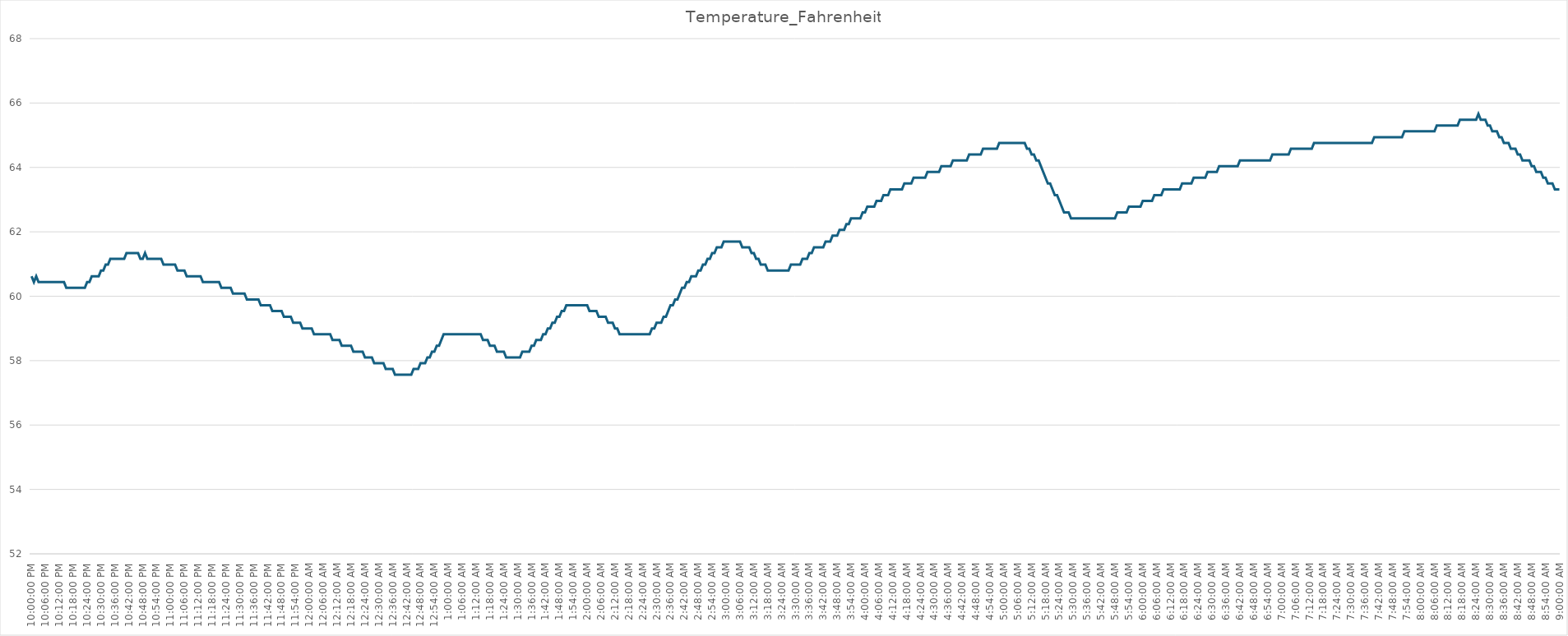
| Category | Temperature_Fahrenheit |
|---|---|
| 2024-03-09 22:00:00 | 60.62 |
| 2024-03-09 22:01:00 | 60.44 |
| 2024-03-09 22:02:00 | 60.62 |
| 2024-03-09 22:03:00 | 60.44 |
| 2024-03-09 22:04:00 | 60.44 |
| 2024-03-09 22:05:00 | 60.44 |
| 2024-03-09 22:06:00 | 60.44 |
| 2024-03-09 22:07:00 | 60.44 |
| 2024-03-09 22:08:00 | 60.44 |
| 2024-03-09 22:09:00 | 60.44 |
| 2024-03-09 22:10:00 | 60.44 |
| 2024-03-09 22:11:00 | 60.44 |
| 2024-03-09 22:12:00 | 60.44 |
| 2024-03-09 22:13:00 | 60.44 |
| 2024-03-09 22:14:00 | 60.44 |
| 2024-03-09 22:15:00 | 60.26 |
| 2024-03-09 22:16:00 | 60.26 |
| 2024-03-09 22:17:00 | 60.26 |
| 2024-03-09 22:18:00 | 60.26 |
| 2024-03-09 22:19:00 | 60.26 |
| 2024-03-09 22:20:00 | 60.26 |
| 2024-03-09 22:21:00 | 60.26 |
| 2024-03-09 22:22:00 | 60.26 |
| 2024-03-09 22:23:00 | 60.26 |
| 2024-03-09 22:24:00 | 60.44 |
| 2024-03-09 22:25:00 | 60.44 |
| 2024-03-09 22:26:00 | 60.62 |
| 2024-03-09 22:27:00 | 60.62 |
| 2024-03-09 22:28:00 | 60.62 |
| 2024-03-09 22:29:00 | 60.62 |
| 2024-03-09 22:30:00 | 60.8 |
| 2024-03-09 22:31:00 | 60.8 |
| 2024-03-09 22:32:00 | 60.98 |
| 2024-03-09 22:33:00 | 60.98 |
| 2024-03-09 22:34:00 | 61.16 |
| 2024-03-09 22:35:00 | 61.16 |
| 2024-03-09 22:36:00 | 61.16 |
| 2024-03-09 22:37:00 | 61.16 |
| 2024-03-09 22:38:00 | 61.16 |
| 2024-03-09 22:39:00 | 61.16 |
| 2024-03-09 22:40:00 | 61.16 |
| 2024-03-09 22:41:00 | 61.34 |
| 2024-03-09 22:42:00 | 61.34 |
| 2024-03-09 22:43:00 | 61.34 |
| 2024-03-09 22:44:00 | 61.34 |
| 2024-03-09 22:45:00 | 61.34 |
| 2024-03-09 22:46:00 | 61.34 |
| 2024-03-09 22:47:00 | 61.16 |
| 2024-03-09 22:48:00 | 61.16 |
| 2024-03-09 22:49:00 | 61.34 |
| 2024-03-09 22:50:00 | 61.16 |
| 2024-03-09 22:51:00 | 61.16 |
| 2024-03-09 22:52:00 | 61.16 |
| 2024-03-09 22:53:00 | 61.16 |
| 2024-03-09 22:54:00 | 61.16 |
| 2024-03-09 22:55:00 | 61.16 |
| 2024-03-09 22:56:00 | 61.16 |
| 2024-03-09 22:57:00 | 60.98 |
| 2024-03-09 22:58:00 | 60.98 |
| 2024-03-09 22:59:00 | 60.98 |
| 2024-03-09 23:00:00 | 60.98 |
| 2024-03-09 23:01:00 | 60.98 |
| 2024-03-09 23:02:00 | 60.98 |
| 2024-03-09 23:03:00 | 60.8 |
| 2024-03-09 23:04:00 | 60.8 |
| 2024-03-09 23:05:00 | 60.8 |
| 2024-03-09 23:06:00 | 60.8 |
| 2024-03-09 23:07:00 | 60.62 |
| 2024-03-09 23:08:00 | 60.62 |
| 2024-03-09 23:09:00 | 60.62 |
| 2024-03-09 23:10:00 | 60.62 |
| 2024-03-09 23:11:00 | 60.62 |
| 2024-03-09 23:12:00 | 60.62 |
| 2024-03-09 23:13:00 | 60.62 |
| 2024-03-09 23:14:00 | 60.44 |
| 2024-03-09 23:15:00 | 60.44 |
| 2024-03-09 23:16:00 | 60.44 |
| 2024-03-09 23:17:00 | 60.44 |
| 2024-03-09 23:18:00 | 60.44 |
| 2024-03-09 23:19:00 | 60.44 |
| 2024-03-09 23:20:00 | 60.44 |
| 2024-03-09 23:21:00 | 60.44 |
| 2024-03-09 23:22:00 | 60.26 |
| 2024-03-09 23:23:00 | 60.26 |
| 2024-03-09 23:24:00 | 60.26 |
| 2024-03-09 23:25:00 | 60.26 |
| 2024-03-09 23:26:00 | 60.26 |
| 2024-03-09 23:27:00 | 60.08 |
| 2024-03-09 23:28:00 | 60.08 |
| 2024-03-09 23:29:00 | 60.08 |
| 2024-03-09 23:30:00 | 60.08 |
| 2024-03-09 23:31:00 | 60.08 |
| 2024-03-09 23:32:00 | 60.08 |
| 2024-03-09 23:33:00 | 59.9 |
| 2024-03-09 23:34:00 | 59.9 |
| 2024-03-09 23:35:00 | 59.9 |
| 2024-03-09 23:36:00 | 59.9 |
| 2024-03-09 23:37:00 | 59.9 |
| 2024-03-09 23:38:00 | 59.9 |
| 2024-03-09 23:39:00 | 59.72 |
| 2024-03-09 23:40:00 | 59.72 |
| 2024-03-09 23:41:00 | 59.72 |
| 2024-03-09 23:42:00 | 59.72 |
| 2024-03-09 23:43:00 | 59.72 |
| 2024-03-09 23:44:00 | 59.54 |
| 2024-03-09 23:45:00 | 59.54 |
| 2024-03-09 23:46:00 | 59.54 |
| 2024-03-09 23:47:00 | 59.54 |
| 2024-03-09 23:48:00 | 59.54 |
| 2024-03-09 23:49:00 | 59.36 |
| 2024-03-09 23:50:00 | 59.36 |
| 2024-03-09 23:51:00 | 59.36 |
| 2024-03-09 23:52:00 | 59.36 |
| 2024-03-09 23:53:00 | 59.18 |
| 2024-03-09 23:54:00 | 59.18 |
| 2024-03-09 23:55:00 | 59.18 |
| 2024-03-09 23:56:00 | 59.18 |
| 2024-03-09 23:57:00 | 59 |
| 2024-03-09 23:58:00 | 59 |
| 2024-03-09 23:59:00 | 59 |
| 2024-03-10 | 59 |
| 2024-03-10 00:01:00 | 59 |
| 2024-03-10 00:02:00 | 58.82 |
| 2024-03-10 00:03:00 | 58.82 |
| 2024-03-10 00:04:00 | 58.82 |
| 2024-03-10 00:05:00 | 58.82 |
| 2024-03-10 00:06:00 | 58.82 |
| 2024-03-10 00:07:00 | 58.82 |
| 2024-03-10 00:08:00 | 58.82 |
| 2024-03-10 00:09:00 | 58.82 |
| 2024-03-10 00:10:00 | 58.64 |
| 2024-03-10 00:11:00 | 58.64 |
| 2024-03-10 00:12:00 | 58.64 |
| 2024-03-10 00:13:00 | 58.64 |
| 2024-03-10 00:14:00 | 58.46 |
| 2024-03-10 00:15:00 | 58.46 |
| 2024-03-10 00:16:00 | 58.46 |
| 2024-03-10 00:17:00 | 58.46 |
| 2024-03-10 00:18:00 | 58.46 |
| 2024-03-10 00:19:00 | 58.28 |
| 2024-03-10 00:20:00 | 58.28 |
| 2024-03-10 00:21:00 | 58.28 |
| 2024-03-10 00:22:00 | 58.28 |
| 2024-03-10 00:23:00 | 58.28 |
| 2024-03-10 00:24:00 | 58.1 |
| 2024-03-10 00:25:00 | 58.1 |
| 2024-03-10 00:26:00 | 58.1 |
| 2024-03-10 00:27:00 | 58.1 |
| 2024-03-10 00:28:00 | 57.92 |
| 2024-03-10 00:29:00 | 57.92 |
| 2024-03-10 00:30:00 | 57.92 |
| 2024-03-10 00:31:00 | 57.92 |
| 2024-03-10 00:32:00 | 57.92 |
| 2024-03-10 00:33:00 | 57.74 |
| 2024-03-10 00:34:00 | 57.74 |
| 2024-03-10 00:35:00 | 57.74 |
| 2024-03-10 00:36:00 | 57.74 |
| 2024-03-10 00:37:00 | 57.56 |
| 2024-03-10 00:38:00 | 57.56 |
| 2024-03-10 00:39:00 | 57.56 |
| 2024-03-10 00:40:00 | 57.56 |
| 2024-03-10 00:41:00 | 57.56 |
| 2024-03-10 00:42:00 | 57.56 |
| 2024-03-10 00:43:00 | 57.56 |
| 2024-03-10 00:44:00 | 57.56 |
| 2024-03-10 00:45:00 | 57.74 |
| 2024-03-10 00:46:00 | 57.74 |
| 2024-03-10 00:47:00 | 57.74 |
| 2024-03-10 00:48:00 | 57.92 |
| 2024-03-10 00:49:00 | 57.92 |
| 2024-03-10 00:50:00 | 57.92 |
| 2024-03-10 00:51:00 | 58.1 |
| 2024-03-10 00:52:00 | 58.1 |
| 2024-03-10 00:53:00 | 58.28 |
| 2024-03-10 00:54:00 | 58.28 |
| 2024-03-10 00:55:00 | 58.46 |
| 2024-03-10 00:56:00 | 58.46 |
| 2024-03-10 00:57:00 | 58.64 |
| 2024-03-10 00:58:00 | 58.82 |
| 2024-03-10 00:59:00 | 58.82 |
| 2024-03-10 01:00:00 | 58.82 |
| 2024-03-10 01:01:00 | 58.82 |
| 2024-03-10 01:02:00 | 58.82 |
| 2024-03-10 01:03:00 | 58.82 |
| 2024-03-10 01:04:00 | 58.82 |
| 2024-03-10 01:05:00 | 58.82 |
| 2024-03-10 01:06:00 | 58.82 |
| 2024-03-10 01:07:00 | 58.82 |
| 2024-03-10 01:08:00 | 58.82 |
| 2024-03-10 01:09:00 | 58.82 |
| 2024-03-10 01:10:00 | 58.82 |
| 2024-03-10 01:11:00 | 58.82 |
| 2024-03-10 01:12:00 | 58.82 |
| 2024-03-10 01:13:00 | 58.82 |
| 2024-03-10 01:14:00 | 58.82 |
| 2024-03-10 01:15:00 | 58.64 |
| 2024-03-10 01:16:00 | 58.64 |
| 2024-03-10 01:17:00 | 58.64 |
| 2024-03-10 01:18:00 | 58.46 |
| 2024-03-10 01:19:00 | 58.46 |
| 2024-03-10 01:20:00 | 58.46 |
| 2024-03-10 01:21:00 | 58.28 |
| 2024-03-10 01:22:00 | 58.28 |
| 2024-03-10 01:23:00 | 58.28 |
| 2024-03-10 01:24:00 | 58.28 |
| 2024-03-10 01:25:00 | 58.1 |
| 2024-03-10 01:26:00 | 58.1 |
| 2024-03-10 01:27:00 | 58.1 |
| 2024-03-10 01:28:00 | 58.1 |
| 2024-03-10 01:29:00 | 58.1 |
| 2024-03-10 01:30:00 | 58.1 |
| 2024-03-10 01:31:00 | 58.1 |
| 2024-03-10 01:32:00 | 58.28 |
| 2024-03-10 01:33:00 | 58.28 |
| 2024-03-10 01:34:00 | 58.28 |
| 2024-03-10 01:35:00 | 58.28 |
| 2024-03-10 01:36:00 | 58.46 |
| 2024-03-10 01:37:00 | 58.46 |
| 2024-03-10 01:38:00 | 58.64 |
| 2024-03-10 01:39:00 | 58.64 |
| 2024-03-10 01:40:00 | 58.64 |
| 2024-03-10 01:41:00 | 58.82 |
| 2024-03-10 01:42:00 | 58.82 |
| 2024-03-10 01:43:00 | 59 |
| 2024-03-10 01:44:00 | 59 |
| 2024-03-10 01:45:00 | 59.18 |
| 2024-03-10 01:46:00 | 59.18 |
| 2024-03-10 01:47:00 | 59.36 |
| 2024-03-10 01:48:00 | 59.36 |
| 2024-03-10 01:49:00 | 59.54 |
| 2024-03-10 01:50:00 | 59.54 |
| 2024-03-10 01:51:00 | 59.72 |
| 2024-03-10 01:52:00 | 59.72 |
| 2024-03-10 01:53:00 | 59.72 |
| 2024-03-10 01:54:00 | 59.72 |
| 2024-03-10 01:55:00 | 59.72 |
| 2024-03-10 01:56:00 | 59.72 |
| 2024-03-10 01:57:00 | 59.72 |
| 2024-03-10 01:58:00 | 59.72 |
| 2024-03-10 01:59:00 | 59.72 |
| 2024-03-10 02:00:00 | 59.72 |
| 2024-03-10 02:01:00 | 59.54 |
| 2024-03-10 02:02:00 | 59.54 |
| 2024-03-10 02:03:00 | 59.54 |
| 2024-03-10 02:04:00 | 59.54 |
| 2024-03-10 02:05:00 | 59.36 |
| 2024-03-10 02:06:00 | 59.36 |
| 2024-03-10 02:07:00 | 59.36 |
| 2024-03-10 02:08:00 | 59.36 |
| 2024-03-10 02:09:00 | 59.18 |
| 2024-03-10 02:10:00 | 59.18 |
| 2024-03-10 02:11:00 | 59.18 |
| 2024-03-10 02:12:00 | 59 |
| 2024-03-10 02:13:00 | 59 |
| 2024-03-10 02:14:00 | 58.82 |
| 2024-03-10 02:15:00 | 58.82 |
| 2024-03-10 02:16:00 | 58.82 |
| 2024-03-10 02:17:00 | 58.82 |
| 2024-03-10 02:18:00 | 58.82 |
| 2024-03-10 02:19:00 | 58.82 |
| 2024-03-10 02:20:00 | 58.82 |
| 2024-03-10 02:21:00 | 58.82 |
| 2024-03-10 02:22:00 | 58.82 |
| 2024-03-10 02:23:00 | 58.82 |
| 2024-03-10 02:24:00 | 58.82 |
| 2024-03-10 02:25:00 | 58.82 |
| 2024-03-10 02:26:00 | 58.82 |
| 2024-03-10 02:27:00 | 58.82 |
| 2024-03-10 02:28:00 | 59 |
| 2024-03-10 02:29:00 | 59 |
| 2024-03-10 02:30:00 | 59.18 |
| 2024-03-10 02:31:00 | 59.18 |
| 2024-03-10 02:32:00 | 59.18 |
| 2024-03-10 02:33:00 | 59.36 |
| 2024-03-10 02:34:00 | 59.36 |
| 2024-03-10 02:35:00 | 59.54 |
| 2024-03-10 02:36:00 | 59.72 |
| 2024-03-10 02:37:00 | 59.72 |
| 2024-03-10 02:38:00 | 59.9 |
| 2024-03-10 02:39:00 | 59.9 |
| 2024-03-10 02:40:00 | 60.08 |
| 2024-03-10 02:41:00 | 60.26 |
| 2024-03-10 02:42:00 | 60.26 |
| 2024-03-10 02:43:00 | 60.44 |
| 2024-03-10 02:44:00 | 60.44 |
| 2024-03-10 02:45:00 | 60.62 |
| 2024-03-10 02:46:00 | 60.62 |
| 2024-03-10 02:47:00 | 60.62 |
| 2024-03-10 02:48:00 | 60.8 |
| 2024-03-10 02:49:00 | 60.8 |
| 2024-03-10 02:50:00 | 60.98 |
| 2024-03-10 02:51:00 | 60.98 |
| 2024-03-10 02:52:00 | 61.16 |
| 2024-03-10 02:53:00 | 61.16 |
| 2024-03-10 02:54:00 | 61.34 |
| 2024-03-10 02:55:00 | 61.34 |
| 2024-03-10 02:56:00 | 61.52 |
| 2024-03-10 02:57:00 | 61.52 |
| 2024-03-10 02:58:00 | 61.52 |
| 2024-03-10 02:59:00 | 61.7 |
| 2024-03-10 03:00:00 | 61.7 |
| 2024-03-10 03:01:00 | 61.7 |
| 2024-03-10 03:02:00 | 61.7 |
| 2024-03-10 03:03:00 | 61.7 |
| 2024-03-10 03:04:00 | 61.7 |
| 2024-03-10 03:05:00 | 61.7 |
| 2024-03-10 03:06:00 | 61.7 |
| 2024-03-10 03:07:00 | 61.52 |
| 2024-03-10 03:08:00 | 61.52 |
| 2024-03-10 03:09:00 | 61.52 |
| 2024-03-10 03:10:00 | 61.52 |
| 2024-03-10 03:11:00 | 61.34 |
| 2024-03-10 03:12:00 | 61.34 |
| 2024-03-10 03:13:00 | 61.16 |
| 2024-03-10 03:14:00 | 61.16 |
| 2024-03-10 03:15:00 | 60.98 |
| 2024-03-10 03:16:00 | 60.98 |
| 2024-03-10 03:17:00 | 60.98 |
| 2024-03-10 03:18:00 | 60.8 |
| 2024-03-10 03:19:00 | 60.8 |
| 2024-03-10 03:20:00 | 60.8 |
| 2024-03-10 03:21:00 | 60.8 |
| 2024-03-10 03:22:00 | 60.8 |
| 2024-03-10 03:23:00 | 60.8 |
| 2024-03-10 03:24:00 | 60.8 |
| 2024-03-10 03:25:00 | 60.8 |
| 2024-03-10 03:26:00 | 60.8 |
| 2024-03-10 03:27:00 | 60.8 |
| 2024-03-10 03:28:00 | 60.98 |
| 2024-03-10 03:29:00 | 60.98 |
| 2024-03-10 03:30:00 | 60.98 |
| 2024-03-10 03:31:00 | 60.98 |
| 2024-03-10 03:32:00 | 60.98 |
| 2024-03-10 03:33:00 | 61.16 |
| 2024-03-10 03:34:00 | 61.16 |
| 2024-03-10 03:35:00 | 61.16 |
| 2024-03-10 03:36:00 | 61.34 |
| 2024-03-10 03:37:00 | 61.34 |
| 2024-03-10 03:38:00 | 61.52 |
| 2024-03-10 03:39:00 | 61.52 |
| 2024-03-10 03:40:00 | 61.52 |
| 2024-03-10 03:41:00 | 61.52 |
| 2024-03-10 03:42:00 | 61.52 |
| 2024-03-10 03:43:00 | 61.7 |
| 2024-03-10 03:44:00 | 61.7 |
| 2024-03-10 03:45:00 | 61.7 |
| 2024-03-10 03:46:00 | 61.88 |
| 2024-03-10 03:47:00 | 61.88 |
| 2024-03-10 03:48:00 | 61.88 |
| 2024-03-10 03:49:00 | 62.06 |
| 2024-03-10 03:50:00 | 62.06 |
| 2024-03-10 03:51:00 | 62.06 |
| 2024-03-10 03:52:00 | 62.24 |
| 2024-03-10 03:53:00 | 62.24 |
| 2024-03-10 03:54:00 | 62.42 |
| 2024-03-10 03:55:00 | 62.42 |
| 2024-03-10 03:56:00 | 62.42 |
| 2024-03-10 03:57:00 | 62.42 |
| 2024-03-10 03:58:00 | 62.42 |
| 2024-03-10 03:59:00 | 62.6 |
| 2024-03-10 04:00:00 | 62.6 |
| 2024-03-10 04:01:00 | 62.78 |
| 2024-03-10 04:02:00 | 62.78 |
| 2024-03-10 04:03:00 | 62.78 |
| 2024-03-10 04:04:00 | 62.78 |
| 2024-03-10 04:05:00 | 62.96 |
| 2024-03-10 04:06:00 | 62.96 |
| 2024-03-10 04:07:00 | 62.96 |
| 2024-03-10 04:08:00 | 63.14 |
| 2024-03-10 04:09:00 | 63.14 |
| 2024-03-10 04:10:00 | 63.14 |
| 2024-03-10 04:11:00 | 63.32 |
| 2024-03-10 04:12:00 | 63.32 |
| 2024-03-10 04:13:00 | 63.32 |
| 2024-03-10 04:14:00 | 63.32 |
| 2024-03-10 04:15:00 | 63.32 |
| 2024-03-10 04:16:00 | 63.32 |
| 2024-03-10 04:17:00 | 63.5 |
| 2024-03-10 04:18:00 | 63.5 |
| 2024-03-10 04:19:00 | 63.5 |
| 2024-03-10 04:20:00 | 63.5 |
| 2024-03-10 04:21:00 | 63.68 |
| 2024-03-10 04:22:00 | 63.68 |
| 2024-03-10 04:23:00 | 63.68 |
| 2024-03-10 04:24:00 | 63.68 |
| 2024-03-10 04:25:00 | 63.68 |
| 2024-03-10 04:26:00 | 63.68 |
| 2024-03-10 04:27:00 | 63.86 |
| 2024-03-10 04:28:00 | 63.86 |
| 2024-03-10 04:29:00 | 63.86 |
| 2024-03-10 04:30:00 | 63.86 |
| 2024-03-10 04:31:00 | 63.86 |
| 2024-03-10 04:32:00 | 63.86 |
| 2024-03-10 04:33:00 | 64.04 |
| 2024-03-10 04:34:00 | 64.04 |
| 2024-03-10 04:35:00 | 64.04 |
| 2024-03-10 04:36:00 | 64.04 |
| 2024-03-10 04:37:00 | 64.04 |
| 2024-03-10 04:38:00 | 64.22 |
| 2024-03-10 04:39:00 | 64.22 |
| 2024-03-10 04:40:00 | 64.22 |
| 2024-03-10 04:41:00 | 64.22 |
| 2024-03-10 04:42:00 | 64.22 |
| 2024-03-10 04:43:00 | 64.22 |
| 2024-03-10 04:44:00 | 64.22 |
| 2024-03-10 04:45:00 | 64.4 |
| 2024-03-10 04:46:00 | 64.4 |
| 2024-03-10 04:47:00 | 64.4 |
| 2024-03-10 04:48:00 | 64.4 |
| 2024-03-10 04:49:00 | 64.4 |
| 2024-03-10 04:50:00 | 64.4 |
| 2024-03-10 04:51:00 | 64.58 |
| 2024-03-10 04:52:00 | 64.58 |
| 2024-03-10 04:53:00 | 64.58 |
| 2024-03-10 04:54:00 | 64.58 |
| 2024-03-10 04:55:00 | 64.58 |
| 2024-03-10 04:56:00 | 64.58 |
| 2024-03-10 04:57:00 | 64.58 |
| 2024-03-10 04:58:00 | 64.76 |
| 2024-03-10 04:59:00 | 64.76 |
| 2024-03-10 05:00:00 | 64.76 |
| 2024-03-10 05:01:00 | 64.76 |
| 2024-03-10 05:02:00 | 64.76 |
| 2024-03-10 05:03:00 | 64.76 |
| 2024-03-10 05:04:00 | 64.76 |
| 2024-03-10 05:05:00 | 64.76 |
| 2024-03-10 05:06:00 | 64.76 |
| 2024-03-10 05:07:00 | 64.76 |
| 2024-03-10 05:08:00 | 64.76 |
| 2024-03-10 05:09:00 | 64.76 |
| 2024-03-10 05:10:00 | 64.58 |
| 2024-03-10 05:11:00 | 64.58 |
| 2024-03-10 05:12:00 | 64.4 |
| 2024-03-10 05:13:00 | 64.4 |
| 2024-03-10 05:14:00 | 64.22 |
| 2024-03-10 05:15:00 | 64.22 |
| 2024-03-10 05:16:00 | 64.04 |
| 2024-03-10 05:17:00 | 63.86 |
| 2024-03-10 05:18:00 | 63.68 |
| 2024-03-10 05:19:00 | 63.5 |
| 2024-03-10 05:20:00 | 63.5 |
| 2024-03-10 05:21:00 | 63.32 |
| 2024-03-10 05:22:00 | 63.14 |
| 2024-03-10 05:23:00 | 63.14 |
| 2024-03-10 05:24:00 | 62.96 |
| 2024-03-10 05:25:00 | 62.78 |
| 2024-03-10 05:26:00 | 62.6 |
| 2024-03-10 05:27:00 | 62.6 |
| 2024-03-10 05:28:00 | 62.6 |
| 2024-03-10 05:29:00 | 62.42 |
| 2024-03-10 05:30:00 | 62.42 |
| 2024-03-10 05:31:00 | 62.42 |
| 2024-03-10 05:32:00 | 62.42 |
| 2024-03-10 05:33:00 | 62.42 |
| 2024-03-10 05:34:00 | 62.42 |
| 2024-03-10 05:35:00 | 62.42 |
| 2024-03-10 05:36:00 | 62.42 |
| 2024-03-10 05:37:00 | 62.42 |
| 2024-03-10 05:38:00 | 62.42 |
| 2024-03-10 05:39:00 | 62.42 |
| 2024-03-10 05:40:00 | 62.42 |
| 2024-03-10 05:41:00 | 62.42 |
| 2024-03-10 05:42:00 | 62.42 |
| 2024-03-10 05:43:00 | 62.42 |
| 2024-03-10 05:44:00 | 62.42 |
| 2024-03-10 05:45:00 | 62.42 |
| 2024-03-10 05:46:00 | 62.42 |
| 2024-03-10 05:47:00 | 62.42 |
| 2024-03-10 05:48:00 | 62.42 |
| 2024-03-10 05:49:00 | 62.6 |
| 2024-03-10 05:50:00 | 62.6 |
| 2024-03-10 05:51:00 | 62.6 |
| 2024-03-10 05:52:00 | 62.6 |
| 2024-03-10 05:53:00 | 62.6 |
| 2024-03-10 05:54:00 | 62.78 |
| 2024-03-10 05:55:00 | 62.78 |
| 2024-03-10 05:56:00 | 62.78 |
| 2024-03-10 05:57:00 | 62.78 |
| 2024-03-10 05:58:00 | 62.78 |
| 2024-03-10 05:59:00 | 62.78 |
| 2024-03-10 06:00:00 | 62.96 |
| 2024-03-10 06:01:00 | 62.96 |
| 2024-03-10 06:02:00 | 62.96 |
| 2024-03-10 06:03:00 | 62.96 |
| 2024-03-10 06:04:00 | 62.96 |
| 2024-03-10 06:05:00 | 63.14 |
| 2024-03-10 06:06:00 | 63.14 |
| 2024-03-10 06:07:00 | 63.14 |
| 2024-03-10 06:08:00 | 63.14 |
| 2024-03-10 06:09:00 | 63.32 |
| 2024-03-10 06:10:00 | 63.32 |
| 2024-03-10 06:11:00 | 63.32 |
| 2024-03-10 06:12:00 | 63.32 |
| 2024-03-10 06:13:00 | 63.32 |
| 2024-03-10 06:14:00 | 63.32 |
| 2024-03-10 06:15:00 | 63.32 |
| 2024-03-10 06:16:00 | 63.32 |
| 2024-03-10 06:17:00 | 63.5 |
| 2024-03-10 06:18:00 | 63.5 |
| 2024-03-10 06:19:00 | 63.5 |
| 2024-03-10 06:20:00 | 63.5 |
| 2024-03-10 06:21:00 | 63.5 |
| 2024-03-10 06:22:00 | 63.68 |
| 2024-03-10 06:23:00 | 63.68 |
| 2024-03-10 06:24:00 | 63.68 |
| 2024-03-10 06:25:00 | 63.68 |
| 2024-03-10 06:26:00 | 63.68 |
| 2024-03-10 06:27:00 | 63.68 |
| 2024-03-10 06:28:00 | 63.86 |
| 2024-03-10 06:29:00 | 63.86 |
| 2024-03-10 06:30:00 | 63.86 |
| 2024-03-10 06:31:00 | 63.86 |
| 2024-03-10 06:32:00 | 63.86 |
| 2024-03-10 06:33:00 | 64.04 |
| 2024-03-10 06:34:00 | 64.04 |
| 2024-03-10 06:35:00 | 64.04 |
| 2024-03-10 06:36:00 | 64.04 |
| 2024-03-10 06:37:00 | 64.04 |
| 2024-03-10 06:38:00 | 64.04 |
| 2024-03-10 06:39:00 | 64.04 |
| 2024-03-10 06:40:00 | 64.04 |
| 2024-03-10 06:41:00 | 64.04 |
| 2024-03-10 06:42:00 | 64.22 |
| 2024-03-10 06:43:00 | 64.22 |
| 2024-03-10 06:44:00 | 64.22 |
| 2024-03-10 06:45:00 | 64.22 |
| 2024-03-10 06:46:00 | 64.22 |
| 2024-03-10 06:47:00 | 64.22 |
| 2024-03-10 06:48:00 | 64.22 |
| 2024-03-10 06:49:00 | 64.22 |
| 2024-03-10 06:50:00 | 64.22 |
| 2024-03-10 06:51:00 | 64.22 |
| 2024-03-10 06:52:00 | 64.22 |
| 2024-03-10 06:53:00 | 64.22 |
| 2024-03-10 06:54:00 | 64.22 |
| 2024-03-10 06:55:00 | 64.22 |
| 2024-03-10 06:56:00 | 64.4 |
| 2024-03-10 06:57:00 | 64.4 |
| 2024-03-10 06:58:00 | 64.4 |
| 2024-03-10 06:59:00 | 64.4 |
| 2024-03-10 07:00:00 | 64.4 |
| 2024-03-10 07:01:00 | 64.4 |
| 2024-03-10 07:02:00 | 64.4 |
| 2024-03-10 07:03:00 | 64.4 |
| 2024-03-10 07:04:00 | 64.58 |
| 2024-03-10 07:05:00 | 64.58 |
| 2024-03-10 07:06:00 | 64.58 |
| 2024-03-10 07:07:00 | 64.58 |
| 2024-03-10 07:08:00 | 64.58 |
| 2024-03-10 07:09:00 | 64.58 |
| 2024-03-10 07:10:00 | 64.58 |
| 2024-03-10 07:11:00 | 64.58 |
| 2024-03-10 07:12:00 | 64.58 |
| 2024-03-10 07:13:00 | 64.58 |
| 2024-03-10 07:14:00 | 64.76 |
| 2024-03-10 07:15:00 | 64.76 |
| 2024-03-10 07:16:00 | 64.76 |
| 2024-03-10 07:17:00 | 64.76 |
| 2024-03-10 07:18:00 | 64.76 |
| 2024-03-10 07:19:00 | 64.76 |
| 2024-03-10 07:20:00 | 64.76 |
| 2024-03-10 07:21:00 | 64.76 |
| 2024-03-10 07:22:00 | 64.76 |
| 2024-03-10 07:23:00 | 64.76 |
| 2024-03-10 07:24:00 | 64.76 |
| 2024-03-10 07:25:00 | 64.76 |
| 2024-03-10 07:26:00 | 64.76 |
| 2024-03-10 07:27:00 | 64.76 |
| 2024-03-10 07:28:00 | 64.76 |
| 2024-03-10 07:29:00 | 64.76 |
| 2024-03-10 07:30:00 | 64.76 |
| 2024-03-10 07:31:00 | 64.76 |
| 2024-03-10 07:32:00 | 64.76 |
| 2024-03-10 07:33:00 | 64.76 |
| 2024-03-10 07:34:00 | 64.76 |
| 2024-03-10 07:35:00 | 64.76 |
| 2024-03-10 07:36:00 | 64.76 |
| 2024-03-10 07:37:00 | 64.76 |
| 2024-03-10 07:38:00 | 64.76 |
| 2024-03-10 07:39:00 | 64.76 |
| 2024-03-10 07:40:00 | 64.94 |
| 2024-03-10 07:41:00 | 64.94 |
| 2024-03-10 07:42:00 | 64.94 |
| 2024-03-10 07:43:00 | 64.94 |
| 2024-03-10 07:44:00 | 64.94 |
| 2024-03-10 07:45:00 | 64.94 |
| 2024-03-10 07:46:00 | 64.94 |
| 2024-03-10 07:47:00 | 64.94 |
| 2024-03-10 07:48:00 | 64.94 |
| 2024-03-10 07:49:00 | 64.94 |
| 2024-03-10 07:50:00 | 64.94 |
| 2024-03-10 07:51:00 | 64.94 |
| 2024-03-10 07:52:00 | 64.94 |
| 2024-03-10 07:53:00 | 65.12 |
| 2024-03-10 07:54:00 | 65.12 |
| 2024-03-10 07:55:00 | 65.12 |
| 2024-03-10 07:56:00 | 65.12 |
| 2024-03-10 07:57:00 | 65.12 |
| 2024-03-10 07:58:00 | 65.12 |
| 2024-03-10 07:59:00 | 65.12 |
| 2024-03-10 08:00:00 | 65.12 |
| 2024-03-10 08:01:00 | 65.12 |
| 2024-03-10 08:02:00 | 65.12 |
| 2024-03-10 08:03:00 | 65.12 |
| 2024-03-10 08:04:00 | 65.12 |
| 2024-03-10 08:05:00 | 65.12 |
| 2024-03-10 08:06:00 | 65.12 |
| 2024-03-10 08:07:00 | 65.3 |
| 2024-03-10 08:08:00 | 65.3 |
| 2024-03-10 08:09:00 | 65.3 |
| 2024-03-10 08:10:00 | 65.3 |
| 2024-03-10 08:11:00 | 65.3 |
| 2024-03-10 08:12:00 | 65.3 |
| 2024-03-10 08:13:00 | 65.3 |
| 2024-03-10 08:14:00 | 65.3 |
| 2024-03-10 08:15:00 | 65.3 |
| 2024-03-10 08:16:00 | 65.3 |
| 2024-03-10 08:17:00 | 65.48 |
| 2024-03-10 08:18:00 | 65.48 |
| 2024-03-10 08:19:00 | 65.48 |
| 2024-03-10 08:20:00 | 65.48 |
| 2024-03-10 08:21:00 | 65.48 |
| 2024-03-10 08:22:00 | 65.48 |
| 2024-03-10 08:23:00 | 65.48 |
| 2024-03-10 08:24:00 | 65.48 |
| 2024-03-10 08:25:00 | 65.66 |
| 2024-03-10 08:26:00 | 65.48 |
| 2024-03-10 08:27:00 | 65.48 |
| 2024-03-10 08:28:00 | 65.48 |
| 2024-03-10 08:29:00 | 65.3 |
| 2024-03-10 08:30:00 | 65.3 |
| 2024-03-10 08:31:00 | 65.12 |
| 2024-03-10 08:32:00 | 65.12 |
| 2024-03-10 08:33:00 | 65.12 |
| 2024-03-10 08:34:00 | 64.94 |
| 2024-03-10 08:35:00 | 64.94 |
| 2024-03-10 08:36:00 | 64.76 |
| 2024-03-10 08:37:00 | 64.76 |
| 2024-03-10 08:38:00 | 64.76 |
| 2024-03-10 08:39:00 | 64.58 |
| 2024-03-10 08:40:00 | 64.58 |
| 2024-03-10 08:41:00 | 64.58 |
| 2024-03-10 08:42:00 | 64.4 |
| 2024-03-10 08:43:00 | 64.4 |
| 2024-03-10 08:44:00 | 64.22 |
| 2024-03-10 08:45:00 | 64.22 |
| 2024-03-10 08:46:00 | 64.22 |
| 2024-03-10 08:47:00 | 64.22 |
| 2024-03-10 08:48:00 | 64.04 |
| 2024-03-10 08:49:00 | 64.04 |
| 2024-03-10 08:50:00 | 63.86 |
| 2024-03-10 08:51:00 | 63.86 |
| 2024-03-10 08:52:00 | 63.86 |
| 2024-03-10 08:53:00 | 63.68 |
| 2024-03-10 08:54:00 | 63.68 |
| 2024-03-10 08:55:00 | 63.5 |
| 2024-03-10 08:56:00 | 63.5 |
| 2024-03-10 08:57:00 | 63.5 |
| 2024-03-10 08:58:00 | 63.32 |
| 2024-03-10 08:59:00 | 63.32 |
| 2024-03-10 09:00:00 | 63.32 |